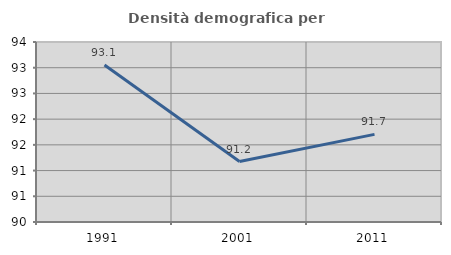
| Category | Densità demografica |
|---|---|
| 1991.0 | 93.054 |
| 2001.0 | 91.175 |
| 2011.0 | 91.703 |